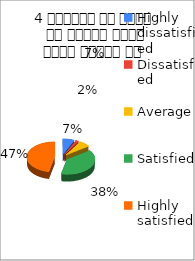
| Category | 4 शिक्षक ने विषय के प्रति रूचि रूचि जागृत की  |
|---|---|
| Highly dissatisfied | 4 |
| Dissatisfied | 1 |
| Average | 4 |
| Satisfied | 23 |
| Highly satisfied | 28 |